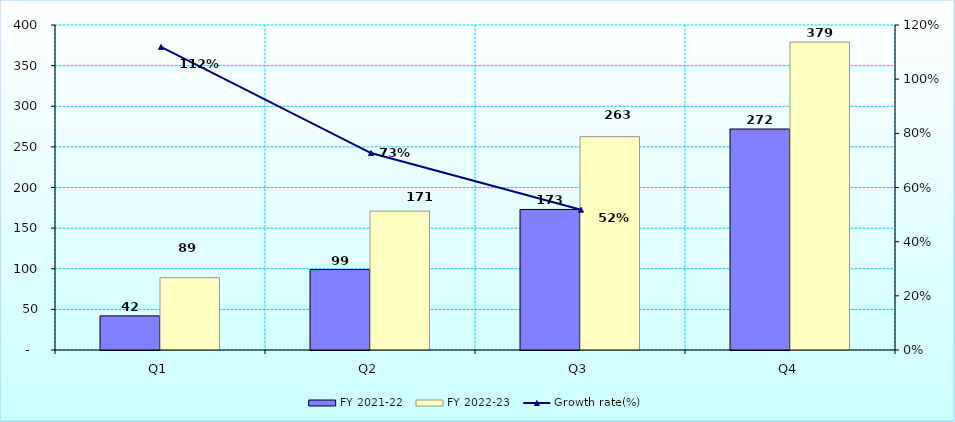
| Category | FY 2021-22 | FY 2022-23 |
|---|---|---|
| Q1 | 42 | 89 |
| Q2 | 99 | 171 |
| Q3 | 173 | 262.588 |
| Q4 | 272 | 379 |